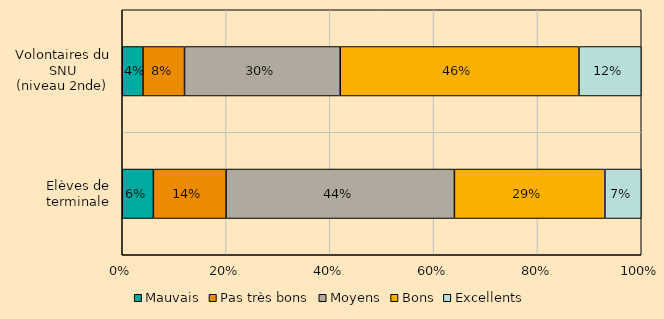
| Category | Mauvais | Pas très bons | Moyens | Bons | Excellents |
|---|---|---|---|---|---|
| Elèves de terminale | 0.06 | 0.14 | 0.44 | 0.29 | 0.07 |
| Volontaires du SNU
(niveau 2nde) | 0.04 | 0.08 | 0.3 | 0.46 | 0.12 |